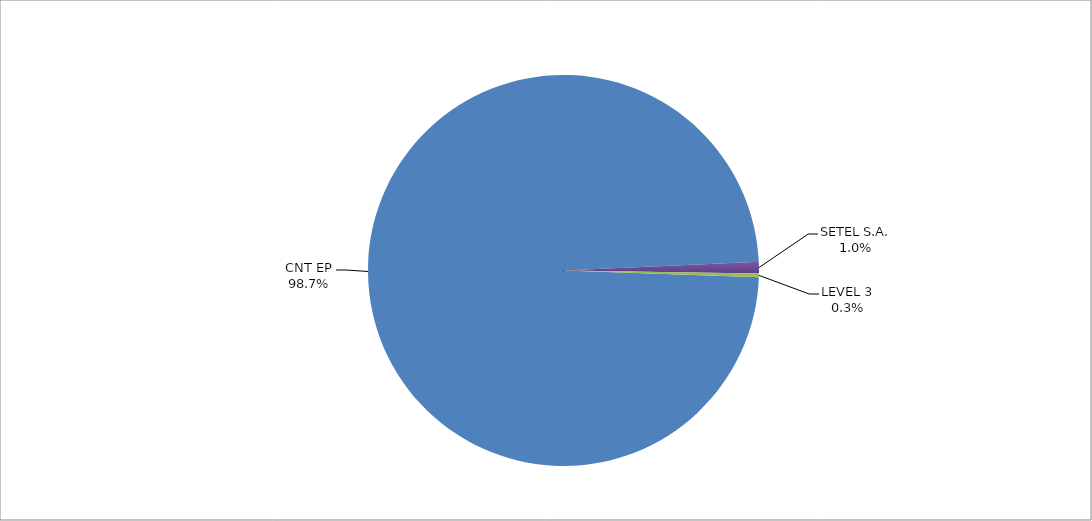
| Category | Series 0 |
|---|---|
| CNT EP | 311 |
| SETEL S.A. | 3 |
| LEVEL 3 | 1 |